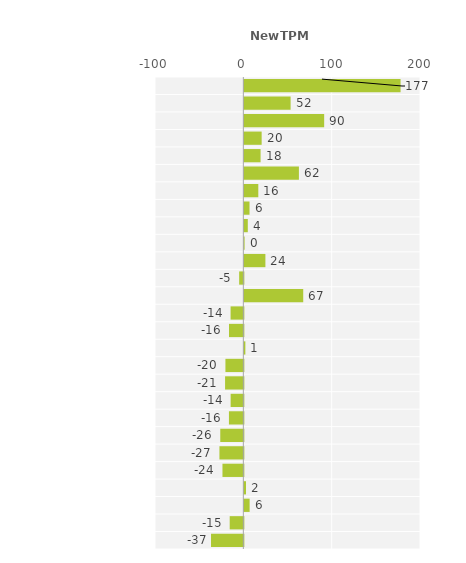
| Category | Series 0 |
|---|---|
| Eastland Network | -36.582 |
| Unison Networks | -15.428 |
| Aurora Energy | 5.988 |
| WEL Networks | 1.861 |
| Wellington Electricity | -23.622 |
| Waipa Networks | -27.066 |
| Centralines | -26.113 |
| PowerNet Ltd | -16.298 |
| Powerco | -14.371 |
| Orion NZ | -20.674 |
| Scanpower | -20.275 |
| Network Tasman | 1.162 |
| MainPower NZ | -16.215 |
| Marlborough Lines | -14.431 |
| Westpower | 66.672 |
| Alpine Energy | -4.719 |
| The Lines Company | 23.853 |
| Nelson Electricity | 0.28 |
| Counties Energy | 3.915 |
| Vector Lines | 5.864 |
| Northpower | 15.82 |
| Horizon Energy | 61.782 |
| Electra | 18.39 |
| Network Waitaki | 19.609 |
| Top Energy | 90.379 |
| EA Networks | 52.387 |
| Buller Electricity | 176.885 |